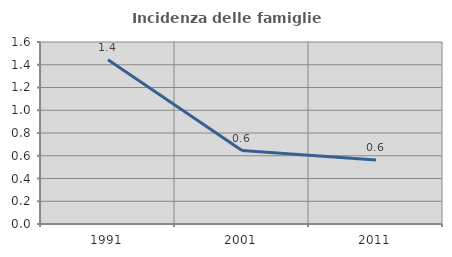
| Category | Incidenza delle famiglie numerose |
|---|---|
| 1991.0 | 1.443 |
| 2001.0 | 0.645 |
| 2011.0 | 0.563 |